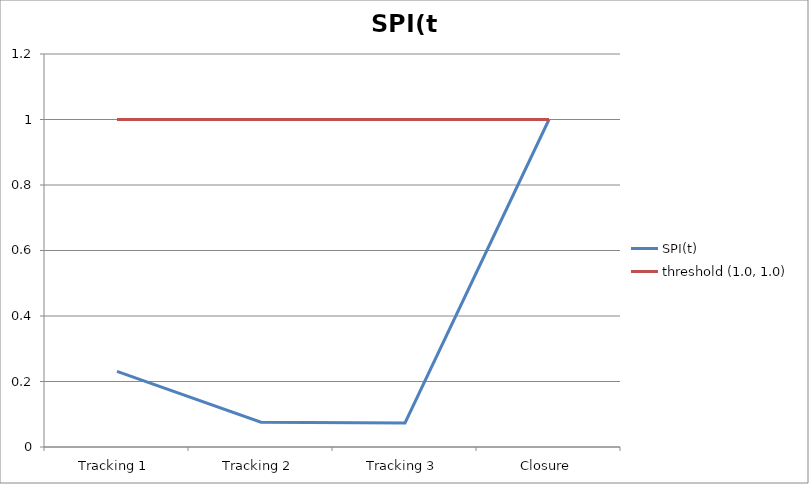
| Category | SPI(t) | threshold (1.0, 1.0) |
|---|---|---|
| Tracking 1 | 0.231 | 1 |
| Tracking 2 | 0.076 | 1 |
| Tracking 3 | 0.073 | 1 |
| Closure | 1 | 1 |